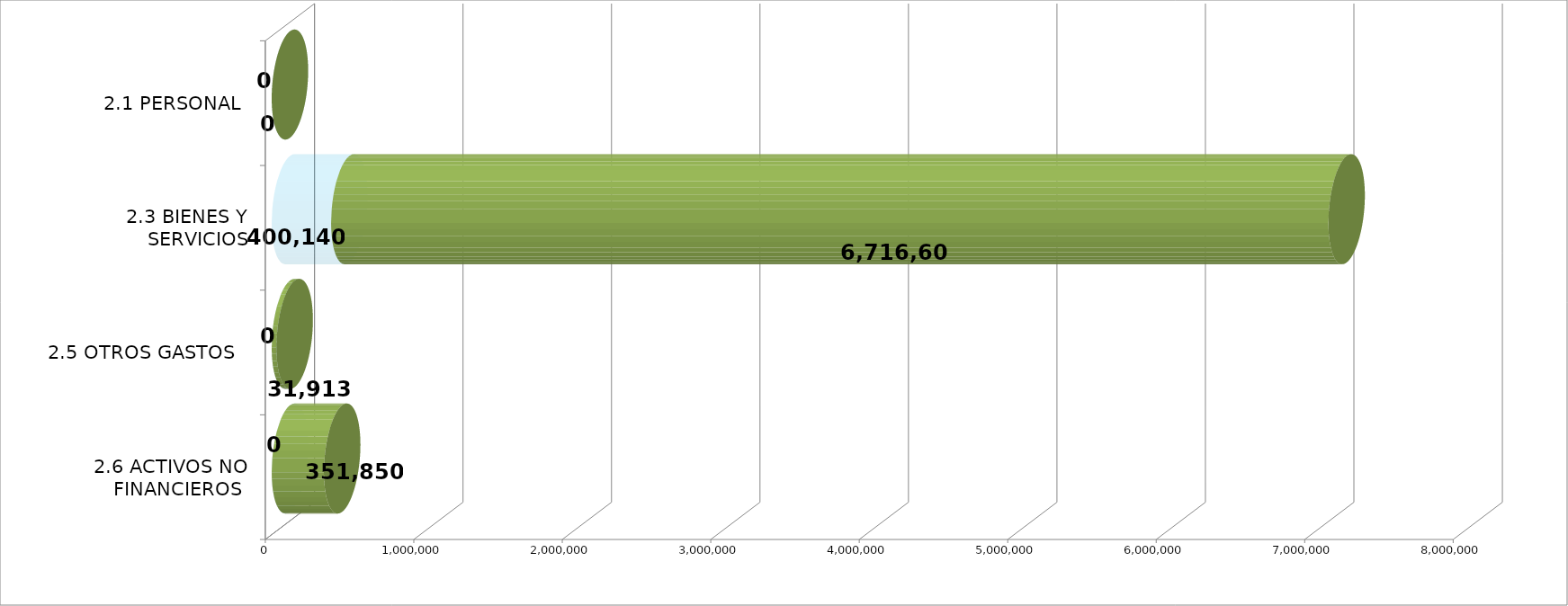
| Category | EJECUTADO | SALDO  |
|---|---|---|
| 2.1 PERSONAL | 0 | 0 |
| 2.3 BIENES Y SERVICIOS | 400140.13 | 6716604.87 |
| 2.5 OTROS GASTOS  | 0 | 31913 |
| 2.6 ACTIVOS NO FINANCIEROS  | 0 | 351850 |